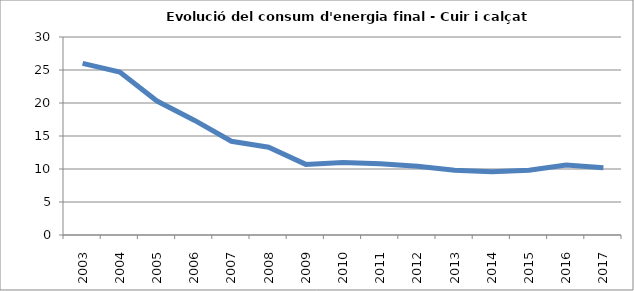
| Category | 26,0 24,7 20,3 17,4 14,2 13,3 10,7 11,0 10,8 10,4 9,8 9,6 9,8 10,6 10,2 |
|---|---|
| 2003.0 | 26 |
| 2004.0 | 24.7 |
| 2005.0 | 20.3 |
| 2006.0 | 17.4 |
| 2007.0 | 14.2 |
| 2008.0 | 13.3 |
| 2009.0 | 10.7 |
| 2010.0 | 11 |
| 2011.0 | 10.8 |
| 2012.0 | 10.4 |
| 2013.0 | 9.8 |
| 2014.0 | 9.6 |
| 2015.0 | 9.8 |
| 2016.0 | 10.6 |
| 2017.0 | 10.2 |